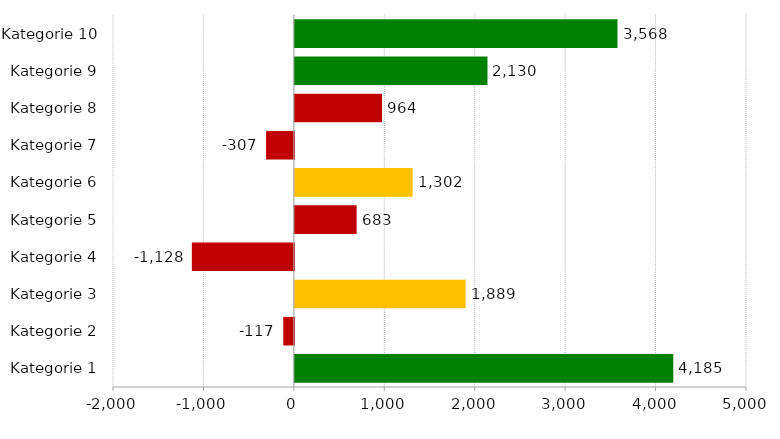
| Category | Dummy 1 | Dummy 2 | Dummy 3 |
|---|---|---|---|
| Kategorie 1 | 0 | 0 | 4185 |
| Kategorie 2 | -117 | 0 | 0 |
| Kategorie 3 | 0 | 1889 | 0 |
| Kategorie 4 | -1128 | 0 | 0 |
| Kategorie 5 | 683 | 0 | 0 |
| Kategorie 6 | 0 | 1302 | 0 |
| Kategorie 7 | -307 | 0 | 0 |
| Kategorie 8 | 964 | 0 | 0 |
| Kategorie 9 | 0 | 0 | 2130 |
| Kategorie 10 | 0 | 0 | 3568 |